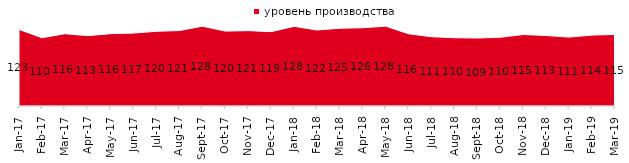
| Category | уровень производства |
|---|---|
| 2017-01-01 | 122.95 |
| 2017-02-01 | 109.5 |
| 2017-03-01 | 116 |
| 2017-04-01 | 112.9 |
| 2017-05-01 | 116.1 |
| 2017-06-01 | 117.05 |
| 2017-07-01 | 119.85 |
| 2017-08-01 | 121.1 |
| 2017-09-01 | 128.05 |
| 2017-10-01 | 120.2 |
| 2017-11-01 | 120.95 |
| 2017-12-01 | 119.35 |
| 2018-01-01 | 127.8 |
| 2018-02-01 | 121.95 |
| 2018-03-01 | 124.8 |
| 2018-04-01 | 125.6 |
| 2018-05-01 | 128.1 |
| 2018-06-01 | 115.8 |
| 2018-07-01 | 111.15 |
| 2018-08-01 | 109.55 |
| 2018-09-01 | 109.1 |
| 2018-10-01 | 110.35 |
| 2018-11-01 | 114.721 |
| 2018-12-01 | 113.1 |
| 2019-01-01 | 110.55 |
| 2019-02-01 | 113.8 |
| 2019-03-01 | 114.868 |